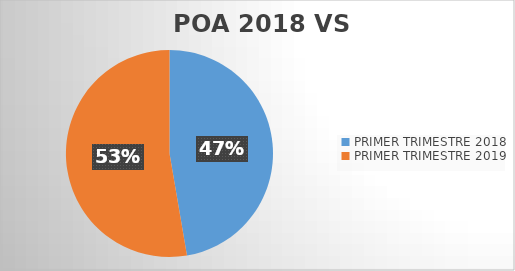
| Category | TOTAL CEDH |
|---|---|
| PRIMER TRIMESTRE 2018 | 59282 |
| PRIMER TRIMESTRE 2019 | 66050 |